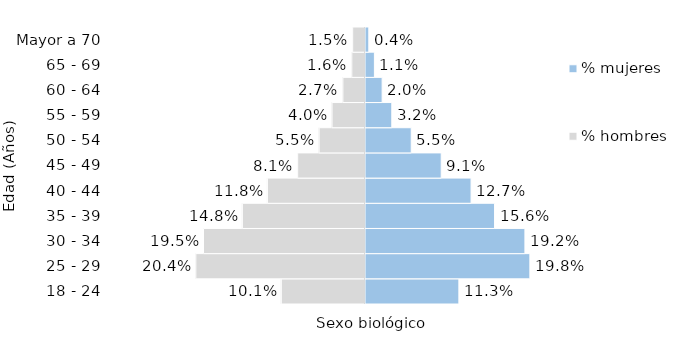
| Category | % hombres | % mujeres |
|---|---|---|
| 18 - 24 | -0.101 | 0.113 |
| 25 - 29 | -0.204 | 0.198 |
| 30 - 34 | -0.195 | 0.192 |
| 35 - 39 | -0.148 | 0.156 |
| 40 - 44 | -0.118 | 0.127 |
| 45 - 49 | -0.081 | 0.091 |
| 50 - 54 | -0.055 | 0.055 |
| 55 - 59 | -0.04 | 0.032 |
| 60 - 64 | -0.027 | 0.02 |
| 65 - 69 | -0.016 | 0.011 |
| Mayor a 70 | -0.015 | 0.004 |